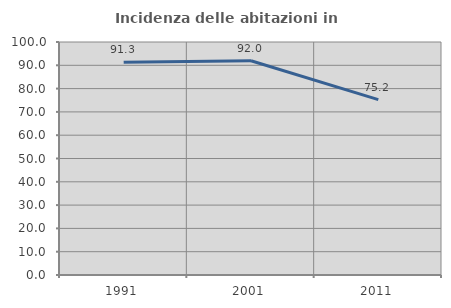
| Category | Incidenza delle abitazioni in proprietà  |
|---|---|
| 1991.0 | 91.32 |
| 2001.0 | 91.975 |
| 2011.0 | 75.24 |